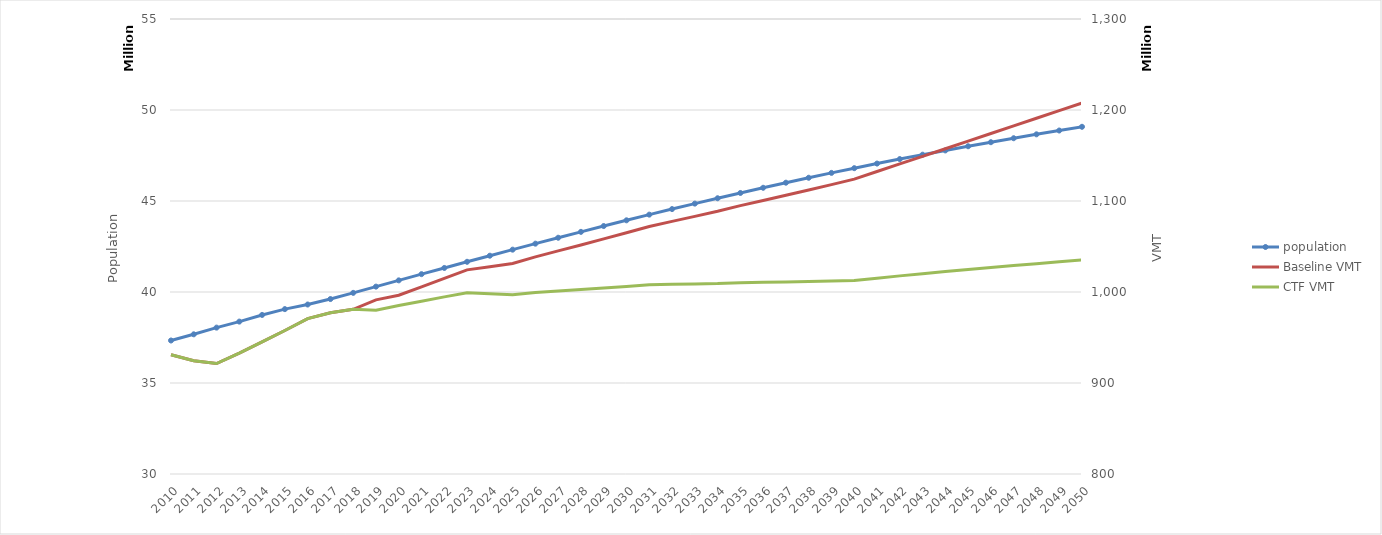
| Category | population |
|---|---|
| 2010.0 | 37335085 |
| 2011.0 | 37675500 |
| 2012.0 | 38042760 |
| 2013.0 | 38373749 |
| 2014.0 | 38739792 |
| 2015.0 | 39059415 |
| 2016.0 | 39312207 |
| 2017.0 | 39613019 |
| 2018.0 | 39952483 |
| 2019.0 | 40295352 |
| 2020.0 | 40639392 |
| 2021.0 | 40980939 |
| 2022.0 | 41321565 |
| 2023.0 | 41659526 |
| 2024.0 | 41994283 |
| 2025.0 | 42326397 |
| 2026.0 | 42655695 |
| 2027.0 | 42981484 |
| 2028.0 | 43304691 |
| 2029.0 | 43624393 |
| 2030.0 | 43939250 |
| 2031.0 | 44250503 |
| 2032.0 | 44556617 |
| 2033.0 | 44856079 |
| 2034.0 | 45150800 |
| 2035.0 | 45440735 |
| 2036.0 | 45726459 |
| 2037.0 | 46006009 |
| 2038.0 | 46277743 |
| 2039.0 | 46544307 |
| 2040.0 | 46804202 |
| 2041.0 | 47056631 |
| 2042.0 | 47303447 |
| 2043.0 | 47544426 |
| 2044.0 | 47778649 |
| 2045.0 | 48007817 |
| 2046.0 | 48230450 |
| 2047.0 | 48449179 |
| 2048.0 | 48663583 |
| 2049.0 | 48872567 |
| 2050.0 | 49077801 |